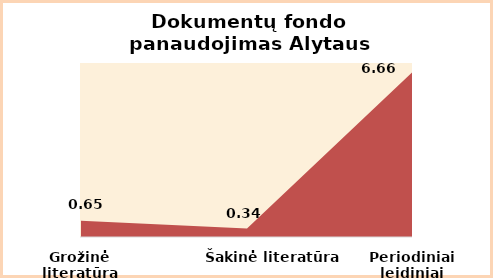
| Category | Series 0 |
|---|---|
| Grožinė literatūra | 0.65 |
| Šakinė literatūra | 0.34 |
| Periodiniai leidiniai | 6.66 |